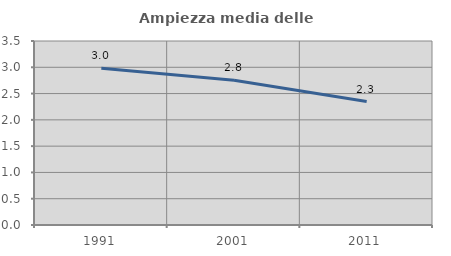
| Category | Ampiezza media delle famiglie |
|---|---|
| 1991.0 | 2.981 |
| 2001.0 | 2.754 |
| 2011.0 | 2.348 |